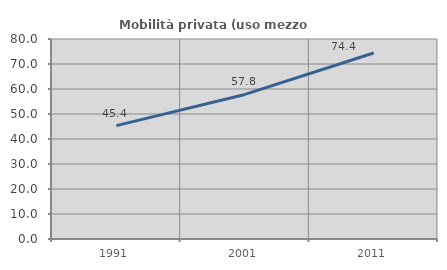
| Category | Mobilità privata (uso mezzo privato) |
|---|---|
| 1991.0 | 45.363 |
| 2001.0 | 57.833 |
| 2011.0 | 74.4 |